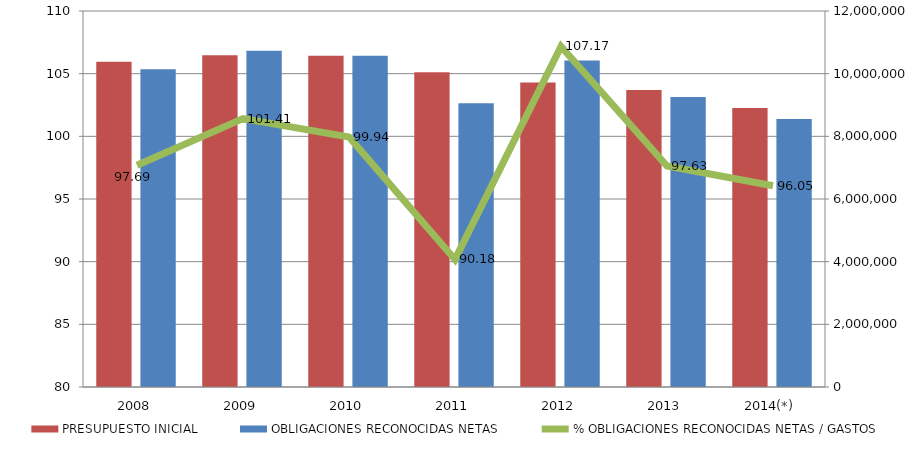
| Category | PRESUPUESTO INICIAL | OBLIGACIONES RECONOCIDAS NETAS |
|---|---|---|
| 2008 | 10384241.1 | 10144083.99 |
| 2009 | 10584541.7 | 10734120.93 |
| 2010 | 10575537.04 | 10569224.36 |
| 2011 | 10045146.21 | 9058639.33 |
| 2012 | 9720048.42 | 10417057.64 |
| 2013 | 9481615.09 | 9256779.75 |
| 2014(*) | 8905196.683 | 8553660.33 |